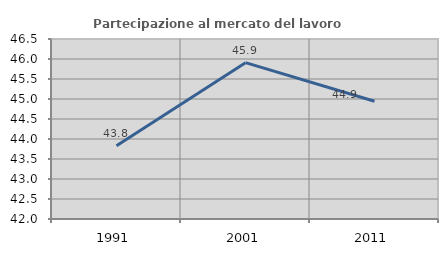
| Category | Partecipazione al mercato del lavoro  femminile |
|---|---|
| 1991.0 | 43.831 |
| 2001.0 | 45.909 |
| 2011.0 | 44.945 |